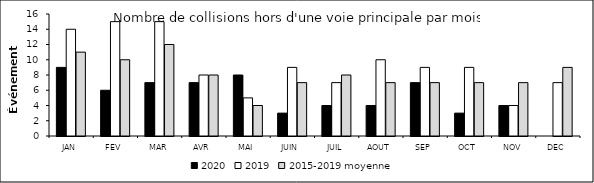
| Category | 2020 | 2019 | 2015-2019 moyenne |
|---|---|---|---|
| JAN | 9 | 14 | 11 |
| FEV | 6 | 15 | 10 |
| MAR | 7 | 15 | 12 |
| AVR | 7 | 8 | 8 |
| MAI | 8 | 5 | 4 |
| JUIN | 3 | 9 | 7 |
| JUIL | 4 | 7 | 8 |
| AOUT | 4 | 10 | 7 |
| SEP | 7 | 9 | 7 |
| OCT | 3 | 9 | 7 |
| NOV | 4 | 4 | 7 |
| DEC | 0 | 7 | 9 |